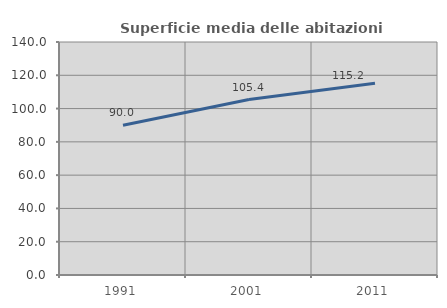
| Category | Superficie media delle abitazioni occupate |
|---|---|
| 1991.0 | 89.989 |
| 2001.0 | 105.405 |
| 2011.0 | 115.247 |